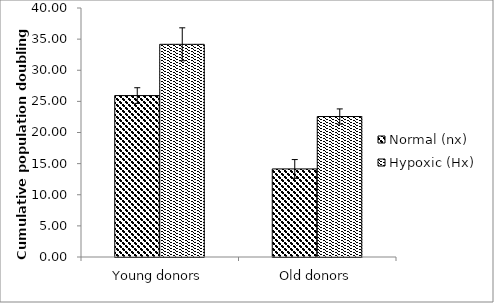
| Category | Normal (nx) | Hypoxic (Hx) |
|---|---|---|
| Young donors | 25.933 | 34.167 |
| Old donors | 14.147 | 22.567 |